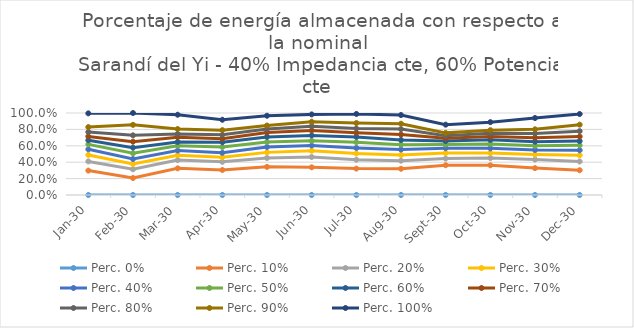
| Category | Perc. 0% | Perc. 10% | Perc. 20% | Perc. 30% | Perc. 40% | Perc. 50% | Perc. 60% | Perc. 70% | Perc. 80% | Perc. 90% | Perc. 100% |
|---|---|---|---|---|---|---|---|---|---|---|---|
| 2030-01-01 | 0 | 0.298 | 0.41 | 0.489 | 0.557 | 0.618 | 0.668 | 0.714 | 0.769 | 0.828 | 0.996 |
| 2030-02-01 | 0 | 0.207 | 0.313 | 0.379 | 0.439 | 0.509 | 0.577 | 0.65 | 0.728 | 0.855 | 1 |
| 2030-03-01 | 0 | 0.325 | 0.426 | 0.485 | 0.542 | 0.6 | 0.647 | 0.705 | 0.745 | 0.805 | 0.979 |
| 2030-04-01 | 0 | 0.305 | 0.404 | 0.46 | 0.515 | 0.585 | 0.643 | 0.686 | 0.734 | 0.791 | 0.918 |
| 2030-05-01 | 0 | 0.343 | 0.452 | 0.52 | 0.585 | 0.646 | 0.708 | 0.762 | 0.805 | 0.847 | 0.967 |
| 2030-06-01 | 0 | 0.337 | 0.464 | 0.539 | 0.603 | 0.662 | 0.727 | 0.788 | 0.839 | 0.894 | 0.983 |
| 2030-07-01 | 0 | 0.322 | 0.431 | 0.507 | 0.574 | 0.642 | 0.708 | 0.758 | 0.811 | 0.877 | 0.988 |
| 2030-08-01 | 0 | 0.32 | 0.418 | 0.489 | 0.555 | 0.614 | 0.671 | 0.737 | 0.803 | 0.869 | 0.975 |
| 2030-09-01 | 0 | 0.363 | 0.444 | 0.512 | 0.571 | 0.616 | 0.657 | 0.692 | 0.723 | 0.758 | 0.858 |
| 2030-10-01 | 0 | 0.362 | 0.45 | 0.512 | 0.569 | 0.622 | 0.672 | 0.712 | 0.752 | 0.791 | 0.888 |
| 2030-11-01 | 0 | 0.328 | 0.432 | 0.493 | 0.55 | 0.601 | 0.65 | 0.698 | 0.749 | 0.801 | 0.939 |
| 2030-12-01 | 0 | 0.302 | 0.408 | 0.484 | 0.546 | 0.606 | 0.658 | 0.713 | 0.779 | 0.858 | 0.988 |